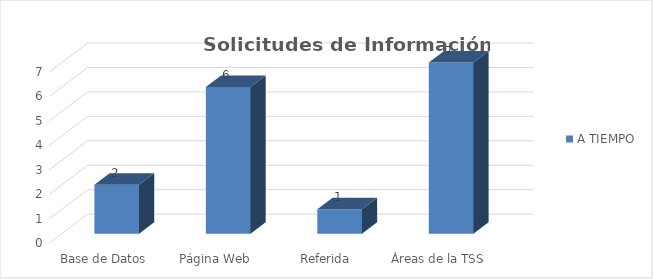
| Category | A TIEMPO |
|---|---|
| Base de Datos | 2 |
| Página Web | 6 |
| Referida | 1 |
| Áreas de la TSS | 7 |